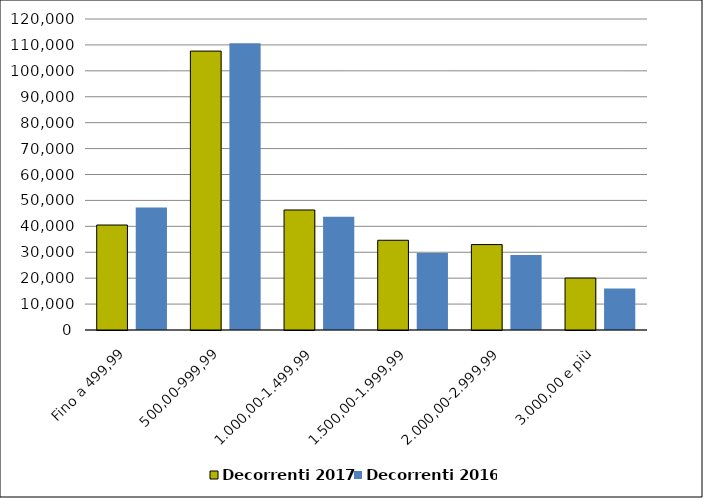
| Category | Decorrenti 2017 | Decorrenti 2016 |
|---|---|---|
| Fino a 499,99 | 40505 | 47268 |
| 500,00-999,99 | 107622 | 110689 |
| 1.000,00-1.499,99 | 46309 | 43701 |
| 1.500,00-1.999,99 | 34619 | 29709 |
| 2.000,00-2.999,99 | 32958 | 28910 |
| 3.000,00 e più | 20041 | 16015 |